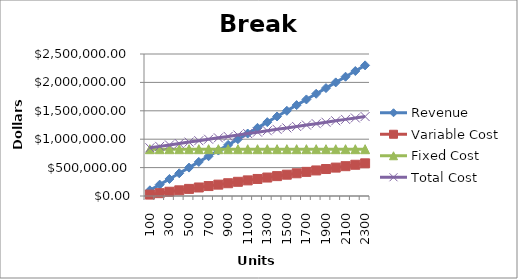
| Category | Revenue | Variable Cost | Fixed Cost | Total Cost |
|---|---|---|---|---|
| 100.0 | 100000 | 25000 | 823889 | 848889 |
| 200.0 | 200000 | 50000 | 823889 | 873889 |
| 300.0 | 300000 | 75000 | 823889 | 898889 |
| 400.0 | 400000 | 100000 | 823889 | 923889 |
| 500.0 | 500000 | 125000 | 823889 | 948889 |
| 600.0 | 600000 | 150000 | 823889 | 973889 |
| 700.0 | 700000 | 175000 | 823889 | 998889 |
| 800.0 | 800000 | 200000 | 823889 | 1023889 |
| 900.0 | 900000 | 225000 | 823889 | 1048889 |
| 1000.0 | 1000000 | 250000 | 823889 | 1073889 |
| 1100.0 | 1100000 | 275000 | 823889 | 1098889 |
| 1200.0 | 1200000 | 300000 | 823889 | 1123889 |
| 1300.0 | 1300000 | 325000 | 823889 | 1148889 |
| 1400.0 | 1400000 | 350000 | 823889 | 1173889 |
| 1500.0 | 1500000 | 375000 | 823889 | 1198889 |
| 1600.0 | 1600000 | 400000 | 823889 | 1223889 |
| 1700.0 | 1700000 | 425000 | 823889 | 1248889 |
| 1800.0 | 1800000 | 450000 | 823889 | 1273889 |
| 1900.0 | 1900000 | 475000 | 823889 | 1298889 |
| 2000.0 | 2000000 | 500000 | 823889 | 1323889 |
| 2100.0 | 2100000 | 525000 | 823889 | 1348889 |
| 2200.0 | 2200000 | 550000 | 823889 | 1373889 |
| 2300.0 | 2300000 | 575000 | 823889 | 1398889 |